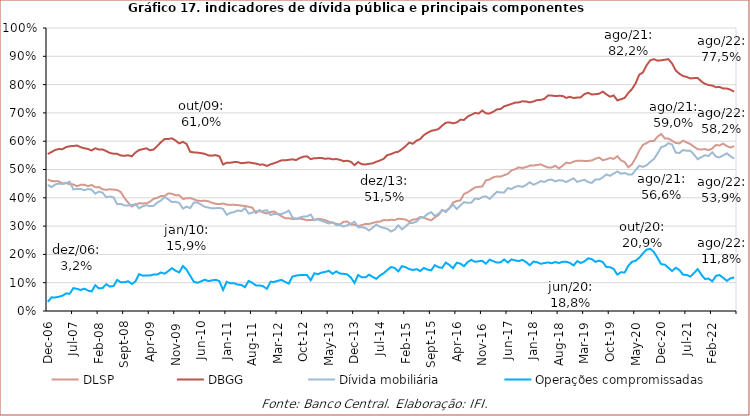
| Category | DLSP | DBGG | Dívida mobiliária | Operações compromissadas |
|---|---|---|---|---|
| 2006-12-01 | 0.465 | 0.555 | 0.446 | 0.032 |
| 2007-01-01 | 0.459 | 0.562 | 0.438 | 0.048 |
| 2007-02-01 | 0.459 | 0.569 | 0.447 | 0.048 |
| 2007-03-01 | 0.458 | 0.572 | 0.451 | 0.05 |
| 2007-04-01 | 0.451 | 0.572 | 0.448 | 0.054 |
| 2007-05-01 | 0.452 | 0.579 | 0.452 | 0.062 |
| 2007-06-01 | 0.448 | 0.582 | 0.457 | 0.061 |
| 2007-07-01 | 0.447 | 0.583 | 0.43 | 0.081 |
| 2007-08-01 | 0.441 | 0.585 | 0.432 | 0.078 |
| 2007-09-01 | 0.446 | 0.579 | 0.431 | 0.074 |
| 2007-10-01 | 0.446 | 0.575 | 0.427 | 0.079 |
| 2007-11-01 | 0.441 | 0.573 | 0.431 | 0.072 |
| 2007-12-01 | 0.445 | 0.567 | 0.429 | 0.069 |
| 2008-01-01 | 0.437 | 0.575 | 0.415 | 0.091 |
| 2008-02-01 | 0.438 | 0.57 | 0.422 | 0.08 |
| 2008-03-01 | 0.43 | 0.571 | 0.418 | 0.081 |
| 2008-04-01 | 0.428 | 0.565 | 0.402 | 0.095 |
| 2008-05-01 | 0.43 | 0.558 | 0.405 | 0.086 |
| 2008-06-01 | 0.429 | 0.556 | 0.402 | 0.088 |
| 2008-07-01 | 0.427 | 0.555 | 0.377 | 0.11 |
| 2008-08-01 | 0.42 | 0.549 | 0.378 | 0.101 |
| 2008-09-01 | 0.4 | 0.548 | 0.373 | 0.101 |
| 2008-10-01 | 0.383 | 0.55 | 0.373 | 0.105 |
| 2008-11-01 | 0.37 | 0.546 | 0.375 | 0.095 |
| 2008-12-01 | 0.376 | 0.56 | 0.378 | 0.105 |
| 2009-01-01 | 0.381 | 0.569 | 0.363 | 0.13 |
| 2009-02-01 | 0.38 | 0.572 | 0.37 | 0.125 |
| 2009-03-01 | 0.38 | 0.575 | 0.374 | 0.126 |
| 2009-04-01 | 0.387 | 0.568 | 0.37 | 0.125 |
| 2009-05-01 | 0.397 | 0.571 | 0.372 | 0.129 |
| 2009-06-01 | 0.4 | 0.583 | 0.383 | 0.129 |
| 2009-07-01 | 0.406 | 0.597 | 0.39 | 0.136 |
| 2009-08-01 | 0.406 | 0.608 | 0.403 | 0.132 |
| 2009-09-01 | 0.416 | 0.608 | 0.394 | 0.141 |
| 2009-10-01 | 0.414 | 0.61 | 0.385 | 0.151 |
| 2009-11-01 | 0.409 | 0.602 | 0.386 | 0.142 |
| 2009-12-01 | 0.409 | 0.592 | 0.382 | 0.136 |
| 2010-01-01 | 0.396 | 0.598 | 0.362 | 0.159 |
| 2010-02-01 | 0.398 | 0.59 | 0.369 | 0.146 |
| 2010-03-01 | 0.399 | 0.562 | 0.364 | 0.125 |
| 2010-04-01 | 0.395 | 0.56 | 0.383 | 0.103 |
| 2010-05-01 | 0.39 | 0.56 | 0.384 | 0.1 |
| 2010-06-01 | 0.389 | 0.558 | 0.376 | 0.105 |
| 2010-07-01 | 0.39 | 0.555 | 0.368 | 0.111 |
| 2010-08-01 | 0.388 | 0.55 | 0.365 | 0.106 |
| 2010-09-01 | 0.382 | 0.549 | 0.363 | 0.108 |
| 2010-10-01 | 0.379 | 0.551 | 0.363 | 0.11 |
| 2010-11-01 | 0.378 | 0.546 | 0.364 | 0.106 |
| 2010-12-01 | 0.38 | 0.518 | 0.361 | 0.074 |
| 2011-01-01 | 0.376 | 0.524 | 0.34 | 0.103 |
| 2011-02-01 | 0.375 | 0.524 | 0.347 | 0.098 |
| 2011-03-01 | 0.375 | 0.526 | 0.35 | 0.098 |
| 2011-04-01 | 0.374 | 0.526 | 0.355 | 0.093 |
| 2011-05-01 | 0.373 | 0.522 | 0.353 | 0.092 |
| 2011-06-01 | 0.371 | 0.524 | 0.364 | 0.084 |
| 2011-07-01 | 0.368 | 0.525 | 0.344 | 0.106 |
| 2011-08-01 | 0.365 | 0.523 | 0.347 | 0.1 |
| 2011-09-01 | 0.347 | 0.521 | 0.353 | 0.09 |
| 2011-10-01 | 0.356 | 0.517 | 0.352 | 0.09 |
| 2011-11-01 | 0.348 | 0.518 | 0.353 | 0.087 |
| 2011-12-01 | 0.345 | 0.513 | 0.357 | 0.078 |
| 2012-01-01 | 0.35 | 0.518 | 0.339 | 0.103 |
| 2012-02-01 | 0.352 | 0.522 | 0.343 | 0.103 |
| 2012-03-01 | 0.343 | 0.527 | 0.342 | 0.107 |
| 2012-04-01 | 0.335 | 0.532 | 0.343 | 0.11 |
| 2012-05-01 | 0.328 | 0.533 | 0.348 | 0.103 |
| 2012-06-01 | 0.328 | 0.534 | 0.355 | 0.097 |
| 2012-07-01 | 0.325 | 0.536 | 0.331 | 0.122 |
| 2012-08-01 | 0.326 | 0.533 | 0.325 | 0.125 |
| 2012-09-01 | 0.326 | 0.54 | 0.33 | 0.127 |
| 2012-10-01 | 0.324 | 0.545 | 0.334 | 0.128 |
| 2012-11-01 | 0.321 | 0.546 | 0.334 | 0.127 |
| 2012-12-01 | 0.322 | 0.537 | 0.341 | 0.109 |
| 2013-01-01 | 0.322 | 0.54 | 0.321 | 0.133 |
| 2013-02-01 | 0.326 | 0.54 | 0.324 | 0.13 |
| 2013-03-01 | 0.324 | 0.541 | 0.318 | 0.136 |
| 2013-04-01 | 0.321 | 0.538 | 0.314 | 0.138 |
| 2013-05-01 | 0.315 | 0.539 | 0.309 | 0.142 |
| 2013-06-01 | 0.312 | 0.536 | 0.314 | 0.131 |
| 2013-07-01 | 0.308 | 0.537 | 0.303 | 0.14 |
| 2013-08-01 | 0.306 | 0.534 | 0.304 | 0.132 |
| 2013-09-01 | 0.315 | 0.529 | 0.298 | 0.131 |
| 2013-10-01 | 0.316 | 0.531 | 0.303 | 0.129 |
| 2013-11-01 | 0.306 | 0.527 | 0.308 | 0.119 |
| 2013-12-01 | 0.305 | 0.515 | 0.315 | 0.099 |
| 2014-01-01 | 0.3 | 0.526 | 0.296 | 0.127 |
| 2014-02-01 | 0.304 | 0.518 | 0.296 | 0.119 |
| 2014-03-01 | 0.308 | 0.518 | 0.293 | 0.119 |
| 2014-04-01 | 0.308 | 0.52 | 0.284 | 0.128 |
| 2014-05-01 | 0.311 | 0.522 | 0.295 | 0.12 |
| 2014-06-01 | 0.315 | 0.527 | 0.305 | 0.114 |
| 2014-07-01 | 0.316 | 0.532 | 0.297 | 0.126 |
| 2014-08-01 | 0.321 | 0.538 | 0.294 | 0.133 |
| 2014-09-01 | 0.321 | 0.551 | 0.29 | 0.145 |
| 2014-10-01 | 0.322 | 0.554 | 0.281 | 0.155 |
| 2014-11-01 | 0.322 | 0.56 | 0.287 | 0.152 |
| 2014-12-01 | 0.326 | 0.563 | 0.303 | 0.14 |
| 2015-01-01 | 0.325 | 0.572 | 0.289 | 0.158 |
| 2015-02-01 | 0.323 | 0.583 | 0.299 | 0.155 |
| 2015-03-01 | 0.316 | 0.595 | 0.311 | 0.148 |
| 2015-04-01 | 0.323 | 0.591 | 0.311 | 0.145 |
| 2015-05-01 | 0.324 | 0.602 | 0.316 | 0.148 |
| 2015-06-01 | 0.332 | 0.607 | 0.33 | 0.141 |
| 2015-07-01 | 0.329 | 0.622 | 0.332 | 0.152 |
| 2015-08-01 | 0.325 | 0.63 | 0.343 | 0.146 |
| 2015-09-01 | 0.32 | 0.636 | 0.349 | 0.144 |
| 2015-10-01 | 0.331 | 0.639 | 0.336 | 0.162 |
| 2015-11-01 | 0.339 | 0.643 | 0.344 | 0.155 |
| 2015-12-01 | 0.356 | 0.655 | 0.357 | 0.152 |
| 2016-01-01 | 0.353 | 0.665 | 0.35 | 0.171 |
| 2016-02-01 | 0.363 | 0.667 | 0.363 | 0.163 |
| 2016-03-01 | 0.383 | 0.663 | 0.376 | 0.151 |
| 2016-04-01 | 0.389 | 0.666 | 0.36 | 0.171 |
| 2016-05-01 | 0.391 | 0.676 | 0.373 | 0.168 |
| 2016-06-01 | 0.413 | 0.675 | 0.385 | 0.158 |
| 2016-07-01 | 0.419 | 0.687 | 0.382 | 0.173 |
| 2016-08-01 | 0.428 | 0.693 | 0.383 | 0.181 |
| 2016-09-01 | 0.436 | 0.7 | 0.398 | 0.174 |
| 2016-10-01 | 0.439 | 0.698 | 0.395 | 0.176 |
| 2016-11-01 | 0.44 | 0.708 | 0.403 | 0.177 |
| 2016-12-01 | 0.461 | 0.698 | 0.405 | 0.167 |
| 2017-01-01 | 0.465 | 0.698 | 0.396 | 0.181 |
| 2017-02-01 | 0.473 | 0.704 | 0.409 | 0.176 |
| 2017-03-01 | 0.475 | 0.712 | 0.421 | 0.171 |
| 2017-04-01 | 0.475 | 0.714 | 0.419 | 0.172 |
| 2017-05-01 | 0.48 | 0.723 | 0.419 | 0.182 |
| 2017-06-01 | 0.484 | 0.727 | 0.435 | 0.171 |
| 2017-07-01 | 0.497 | 0.732 | 0.431 | 0.183 |
| 2017-08-01 | 0.501 | 0.736 | 0.439 | 0.179 |
| 2017-09-01 | 0.508 | 0.737 | 0.442 | 0.177 |
| 2017-10-01 | 0.505 | 0.741 | 0.439 | 0.181 |
| 2017-11-01 | 0.509 | 0.74 | 0.445 | 0.173 |
| 2017-12-01 | 0.514 | 0.737 | 0.455 | 0.162 |
| 2018-01-01 | 0.514 | 0.74 | 0.446 | 0.175 |
| 2018-02-01 | 0.516 | 0.745 | 0.451 | 0.172 |
| 2018-03-01 | 0.518 | 0.746 | 0.459 | 0.167 |
| 2018-04-01 | 0.512 | 0.75 | 0.456 | 0.169 |
| 2018-05-01 | 0.507 | 0.761 | 0.463 | 0.172 |
| 2018-06-01 | 0.507 | 0.761 | 0.464 | 0.169 |
| 2018-07-01 | 0.513 | 0.76 | 0.458 | 0.173 |
| 2018-08-01 | 0.503 | 0.76 | 0.462 | 0.17 |
| 2018-09-01 | 0.513 | 0.76 | 0.461 | 0.174 |
| 2018-10-01 | 0.524 | 0.753 | 0.456 | 0.174 |
| 2018-11-01 | 0.522 | 0.757 | 0.462 | 0.17 |
| 2018-12-01 | 0.528 | 0.753 | 0.469 | 0.161 |
| 2019-01-01 | 0.531 | 0.754 | 0.456 | 0.176 |
| 2019-02-01 | 0.531 | 0.755 | 0.46 | 0.17 |
| 2019-03-01 | 0.53 | 0.767 | 0.464 | 0.175 |
| 2019-04-01 | 0.53 | 0.771 | 0.456 | 0.186 |
| 2019-05-01 | 0.532 | 0.765 | 0.452 | 0.183 |
| 2019-06-01 | 0.538 | 0.766 | 0.465 | 0.174 |
| 2019-07-01 | 0.542 | 0.768 | 0.465 | 0.178 |
| 2019-08-01 | 0.533 | 0.775 | 0.472 | 0.173 |
| 2019-09-01 | 0.536 | 0.766 | 0.483 | 0.155 |
| 2019-10-01 | 0.541 | 0.757 | 0.478 | 0.155 |
| 2019-11-01 | 0.538 | 0.762 | 0.486 | 0.148 |
| 2019-12-01 | 0.547 | 0.744 | 0.493 | 0.129 |
| 2020-01-01 | 0.532 | 0.748 | 0.485 | 0.137 |
| 2020-02-01 | 0.526 | 0.753 | 0.488 | 0.136 |
| 2020-03-01 | 0.508 | 0.77 | 0.482 | 0.16 |
| 2020-04-01 | 0.518 | 0.784 | 0.482 | 0.174 |
| 2020-05-01 | 0.54 | 0.804 | 0.498 | 0.178 |
| 2020-06-01 | 0.567 | 0.835 | 0.513 | 0.188 |
| 2020-07-01 | 0.587 | 0.843 | 0.509 | 0.203 |
| 2020-08-01 | 0.593 | 0.868 | 0.515 | 0.217 |
| 2020-09-01 | 0.601 | 0.886 | 0.526 | 0.219 |
| 2020-10-01 | 0.6 | 0.89 | 0.537 | 0.209 |
| 2020-11-01 | 0.616 | 0.884 | 0.556 | 0.188 |
| 2020-12-01 | 0.625 | 0.886 | 0.579 | 0.165 |
| 2021-01-01 | 0.61 | 0.888 | 0.583 | 0.164 |
| 2021-02-01 | 0.61 | 0.89 | 0.593 | 0.153 |
| 2021-03-01 | 0.601 | 0.874 | 0.588 | 0.141 |
| 2021-04-01 | 0.594 | 0.85 | 0.56 | 0.153 |
| 2021-05-01 | 0.592 | 0.838 | 0.558 | 0.145 |
| 2021-06-01 | 0.602 | 0.83 | 0.569 | 0.128 |
| 2021-07-01 | 0.595 | 0.827 | 0.566 | 0.127 |
| 2021-08-01 | 0.59 | 0.822 | 0.566 | 0.122 |
| 2021-09-01 | 0.581 | 0.823 | 0.553 | 0.134 |
| 2021-10-01 | 0.572 | 0.823 | 0.536 | 0.148 |
| 2021-11-01 | 0.57 | 0.811 | 0.544 | 0.129 |
| 2021-12-01 | 0.572 | 0.803 | 0.55 | 0.113 |
| 2022-01-01 | 0.568 | 0.798 | 0.548 | 0.115 |
| 2022-02-01 | 0.574 | 0.797 | 0.561 | 0.105 |
| 2022-03-01 | 0.587 | 0.791 | 0.546 | 0.124 |
| 2022-04-01 | 0.585 | 0.792 | 0.543 | 0.127 |
| 2022-05-01 | 0.591 | 0.786 | 0.55 | 0.117 |
| 2022-06-01 | 0.583 | 0.786 | 0.557 | 0.106 |
| 2022-07-01 | 0.578 | 0.782 | 0.546 | 0.116 |
| 2022-08-01 | 0.582 | 0.775 | 0.539 | 0.118 |